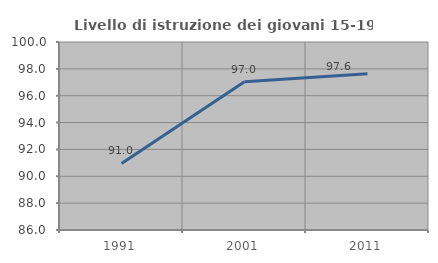
| Category | Livello di istruzione dei giovani 15-19 anni |
|---|---|
| 1991.0 | 90.957 |
| 2001.0 | 97.037 |
| 2011.0 | 97.63 |